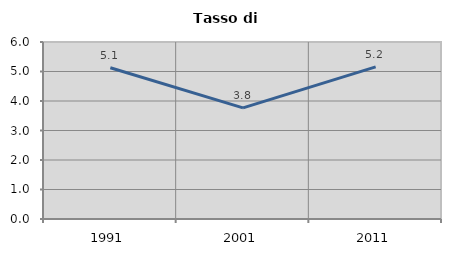
| Category | Tasso di disoccupazione   |
|---|---|
| 1991.0 | 5.125 |
| 2001.0 | 3.766 |
| 2011.0 | 5.159 |